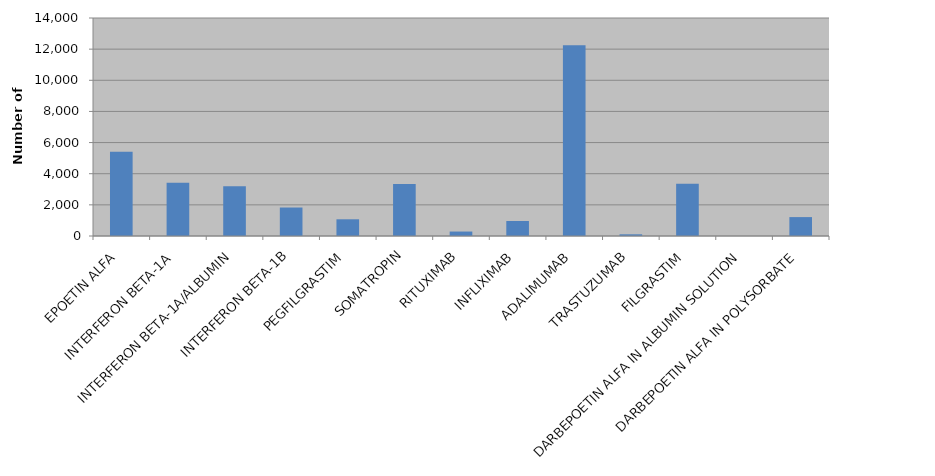
| Category | Total |
|---|---|
| EPOETIN ALFA | 5415 |
| INTERFERON BETA-1A | 3427 |
| INTERFERON BETA-1A/ALBUMIN | 3202 |
| INTERFERON BETA-1B | 1829 |
| PEGFILGRASTIM | 1073 |
| SOMATROPIN | 3335 |
| RITUXIMAB | 286 |
| INFLIXIMAB | 962 |
| ADALIMUMAB | 12243 |
| TRASTUZUMAB | 108 |
| FILGRASTIM | 3362 |
| DARBEPOETIN ALFA IN ALBUMIN SOLUTION | 2 |
| DARBEPOETIN ALFA IN POLYSORBATE | 1214 |